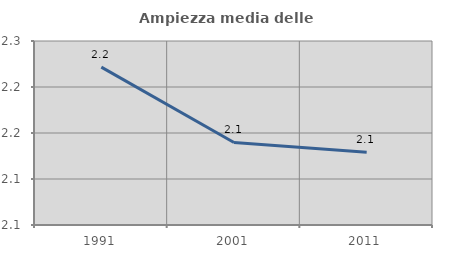
| Category | Ampiezza media delle famiglie |
|---|---|
| 1991.0 | 2.222 |
| 2001.0 | 2.14 |
| 2011.0 | 2.129 |